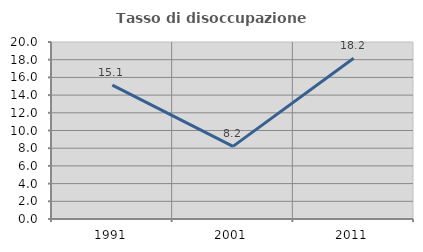
| Category | Tasso di disoccupazione giovanile  |
|---|---|
| 1991.0 | 15.133 |
| 2001.0 | 8.209 |
| 2011.0 | 18.155 |